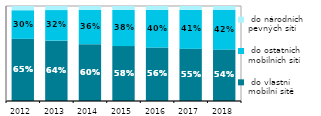
| Category |  do vlastní 
mobilní sítě |  do ostatních 
mobilních sítí |  do národních 
pevných sítí |
|---|---|---|---|
| 2012.0 | 0.655 | 0.301 | 0.045 |
| 2013.0 | 0.635 | 0.322 | 0.043 |
| 2014.0 | 0.598 | 0.36 | 0.042 |
| 2015.0 | 0.578 | 0.381 | 0.041 |
| 2016.0 | 0.563 | 0.397 | 0.04 |
| 2017.0 | 0.549 | 0.411 | 0.04 |
| 2018.0 | 0.541 | 0.42 | 0.039 |